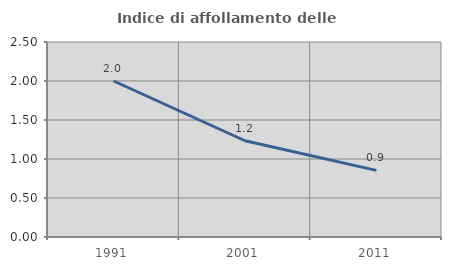
| Category | Indice di affollamento delle abitazioni  |
|---|---|
| 1991.0 | 2 |
| 2001.0 | 1.234 |
| 2011.0 | 0.854 |